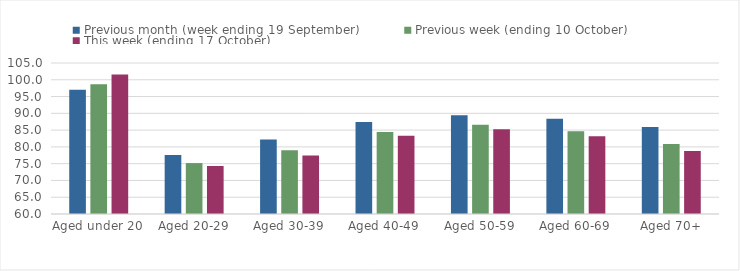
| Category | Previous month (week ending 19 September) | Previous week (ending 10 October) | This week (ending 17 October) |
|---|---|---|---|
| Aged under 20 | 97 | 98.64 | 101.55 |
| Aged 20-29 | 77.57 | 75.17 | 74.3 |
| Aged 30-39 | 82.18 | 79.02 | 77.47 |
| Aged 40-49 | 87.44 | 84.43 | 83.35 |
| Aged 50-59 | 89.4 | 86.6 | 85.25 |
| Aged 60-69 | 88.39 | 84.67 | 83.18 |
| Aged 70+ | 85.92 | 80.89 | 78.77 |